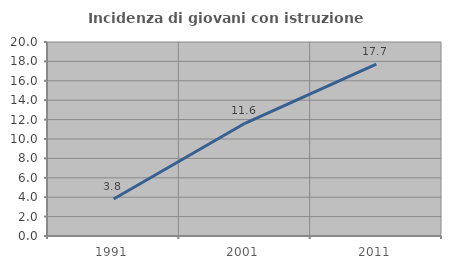
| Category | Incidenza di giovani con istruzione universitaria |
|---|---|
| 1991.0 | 3.81 |
| 2001.0 | 11.621 |
| 2011.0 | 17.727 |